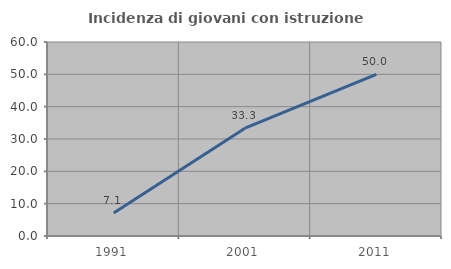
| Category | Incidenza di giovani con istruzione universitaria |
|---|---|
| 1991.0 | 7.143 |
| 2001.0 | 33.333 |
| 2011.0 | 50 |